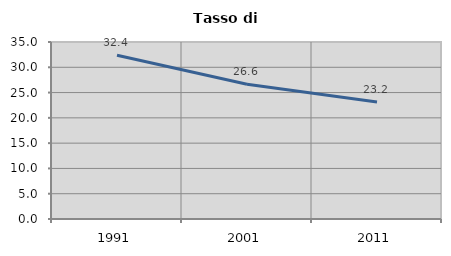
| Category | Tasso di disoccupazione   |
|---|---|
| 1991.0 | 32.385 |
| 2001.0 | 26.641 |
| 2011.0 | 23.154 |